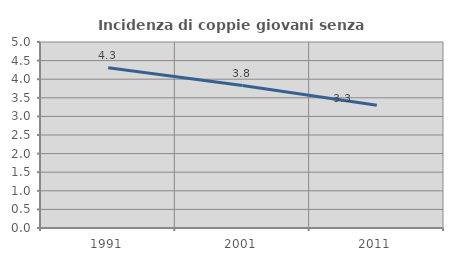
| Category | Incidenza di coppie giovani senza figli |
|---|---|
| 1991.0 | 4.309 |
| 2001.0 | 3.83 |
| 2011.0 | 3.299 |